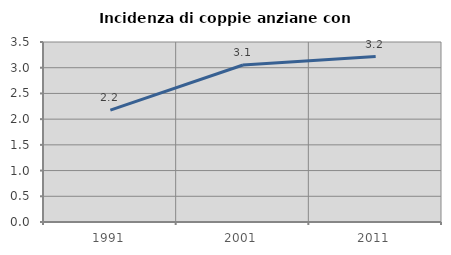
| Category | Incidenza di coppie anziane con figli |
|---|---|
| 1991.0 | 2.174 |
| 2001.0 | 3.052 |
| 2011.0 | 3.216 |